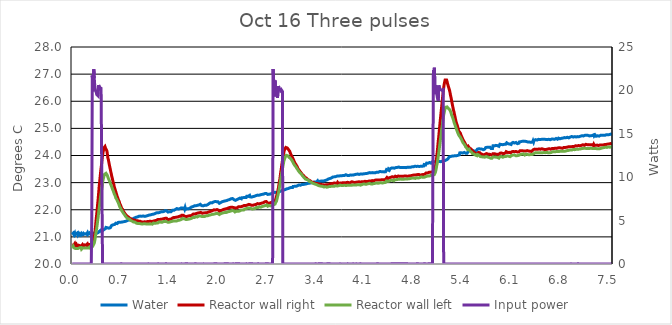
| Category | Water | Reactor wall right | Reactor wall left |
|---|---|---|---|
| 0.0015577622222222223 | 21.09 | 20.711 | 20.597 |
| 0.008027616666666666 | 21.113 | 20.715 | 20.602 |
| 0.014572455555555554 | 21.134 | 20.74 | 20.653 |
| 0.02137698611111111 | 21.094 | 20.7 | 20.603 |
| 0.028150972222222223 | 21.107 | 20.716 | 20.616 |
| 0.03498602777777778 | 21.148 | 20.751 | 20.626 |
| 0.04182113888888889 | 21.074 | 20.683 | 20.575 |
| 0.048596499999999994 | 21.108 | 20.706 | 20.583 |
| 0.055370472222222224 | 21.119 | 20.726 | 20.606 |
| 0.06214444444444445 | 21.122 | 20.676 | 20.569 |
| 0.06897952777777779 | 21.099 | 20.689 | 20.597 |
| 0.07578405555555556 | 21.153 | 20.708 | 20.605 |
| 0.08261913888888889 | 21.072 | 20.646 | 20.573 |
| 0.08939311111111112 | 21.088 | 20.691 | 20.583 |
| 0.09610600000000001 | 21.123 | 20.707 | 20.58 |
| 0.1029716111111111 | 21.1 | 20.686 | 20.6 |
| 0.10977613888888889 | 21.073 | 20.672 | 20.566 |
| 0.11655155555555556 | 21.106 | 20.688 | 20.582 |
| 0.12337130555555556 | 21.12 | 20.706 | 20.605 |
| 0.13017602777777776 | 21.076 | 20.666 | 20.549 |
| 0.13694983333333333 | 21.097 | 20.681 | 20.572 |
| 0.14370852777777776 | 21.106 | 20.715 | 20.588 |
| 0.15054361111111111 | 21.128 | 20.724 | 20.621 |
| 0.15731758333333334 | 21.088 | 20.657 | 20.566 |
| 0.16413738888888887 | 21.079 | 20.68 | 20.589 |
| 0.17091138888888888 | 21.114 | 20.704 | 20.599 |
| 0.1776867222222222 | 21.117 | 20.71 | 20.594 |
| 0.18449125 | 21.101 | 20.693 | 20.593 |
| 0.19132633333333335 | 21.084 | 20.69 | 20.57 |
| 0.19810033333333332 | 21.097 | 20.701 | 20.593 |
| 0.20487430555555555 | 21.113 | 20.706 | 20.593 |
| 0.2117246388888889 | 21.153 | 20.742 | 20.603 |
| 0.2184986388888889 | 21.092 | 20.69 | 20.592 |
| 0.22537952777777778 | 21.088 | 20.686 | 20.591 |
| 0.23210769444444446 | 21.097 | 20.69 | 20.62 |
| 0.23889694444444445 | 21.144 | 20.718 | 20.612 |
| 0.24567230555555555 | 21.147 | 20.751 | 20.633 |
| 0.2525073888888889 | 21.117 | 20.7 | 20.591 |
| 0.2592508055555556 | 21.082 | 20.7 | 20.603 |
| 0.2660901111111111 | 21.12 | 20.719 | 20.611 |
| 0.27287516666666667 | 21.125 | 20.729 | 20.616 |
| 0.279695 | 21.153 | 20.76 | 20.644 |
| 0.28643833333333335 | 21.14 | 20.781 | 20.657 |
| 0.2933344444444444 | 21.133 | 20.788 | 20.654 |
| 0.3000933333333333 | 21.108 | 20.857 | 20.689 |
| 0.3068825 | 21.131 | 20.97 | 20.772 |
| 0.3137022222222222 | 21.126 | 21.097 | 20.847 |
| 0.3204777777777778 | 21.149 | 21.254 | 20.965 |
| 0.3272363888888889 | 21.174 | 21.45 | 21.087 |
| 0.33404083333333334 | 21.209 | 21.655 | 21.218 |
| 0.3408761111111111 | 21.132 | 21.821 | 21.31 |
| 0.3476805555555556 | 21.135 | 21.996 | 21.446 |
| 0.35443916666666664 | 21.138 | 22.209 | 21.591 |
| 0.36127444444444445 | 21.156 | 22.39 | 21.725 |
| 0.3680483333333333 | 21.192 | 22.608 | 21.9 |
| 0.3748375 | 21.2 | 22.833 | 22.029 |
| 0.3816127777777778 | 21.205 | 23.014 | 22.183 |
| 0.38843277777777774 | 21.221 | 23.193 | 22.326 |
| 0.3952219444444444 | 21.241 | 23.381 | 22.487 |
| 0.40199583333333333 | 21.23 | 23.528 | 22.604 |
| 0.4088158333333334 | 21.189 | 23.677 | 22.716 |
| 0.41565083333333336 | 21.224 | 23.85 | 22.843 |
| 0.42247055555555557 | 21.23 | 23.998 | 22.983 |
| 0.4292294444444445 | 21.258 | 24.117 | 23.103 |
| 0.43600333333333335 | 21.258 | 24.207 | 23.172 |
| 0.44279250000000003 | 21.271 | 24.288 | 23.239 |
| 0.4495986111111111 | 21.294 | 24.314 | 23.305 |
| 0.45640305555555555 | 21.279 | 24.332 | 23.335 |
| 0.4631922222222222 | 21.304 | 24.276 | 23.33 |
| 0.4700272222222222 | 21.349 | 24.267 | 23.343 |
| 0.47680138888888884 | 21.358 | 24.201 | 23.32 |
| 0.48360583333333335 | 21.371 | 24.162 | 23.313 |
| 0.4903797222222222 | 21.335 | 24.033 | 23.261 |
| 0.49715388888888884 | 21.305 | 23.905 | 23.196 |
| 0.5039888888888888 | 21.325 | 23.838 | 23.151 |
| 0.5107475 | 21.321 | 23.741 | 23.117 |
| 0.5175688888888889 | 21.326 | 23.649 | 23.071 |
| 0.5243427777777778 | 21.35 | 23.56 | 23.018 |
| 0.5311777777777777 | 21.337 | 23.483 | 22.987 |
| 0.5379825 | 21.374 | 23.394 | 22.921 |
| 0.5447563888888889 | 21.394 | 23.314 | 22.885 |
| 0.5515761111111112 | 21.429 | 23.225 | 22.837 |
| 0.5583502777777778 | 21.416 | 23.153 | 22.778 |
| 0.5650936111111111 | 21.444 | 23.072 | 22.732 |
| 0.5719897222222222 | 21.447 | 22.99 | 22.691 |
| 0.5787788888888888 | 21.449 | 22.939 | 22.663 |
| 0.5855530555555556 | 21.467 | 22.847 | 22.586 |
| 0.5923130555555556 | 21.46 | 22.788 | 22.556 |
| 0.5991483333333334 | 21.47 | 22.73 | 22.507 |
| 0.6059222222222223 | 21.504 | 22.671 | 22.439 |
| 0.6127266666666666 | 21.491 | 22.61 | 22.428 |
| 0.6195158333333334 | 21.486 | 22.554 | 22.385 |
| 0.6263358333333334 | 21.491 | 22.485 | 22.339 |
| 0.6330944444444444 | 21.519 | 22.444 | 22.303 |
| 0.6399447222222222 | 21.532 | 22.383 | 22.265 |
| 0.6467186111111111 | 21.55 | 22.349 | 22.234 |
| 0.6535386111111111 | 21.556 | 22.309 | 22.173 |
| 0.6603138888888889 | 21.543 | 22.239 | 22.114 |
| 0.6671488888888889 | 21.551 | 22.198 | 22.109 |
| 0.6739230555555555 | 21.564 | 22.163 | 22.057 |
| 0.6807580555555555 | 21.542 | 22.118 | 22.031 |
| 0.6875013888888889 | 21.531 | 22.057 | 21.977 |
| 0.6943366666666667 | 21.543 | 22.043 | 21.953 |
| 0.7010952777777778 | 21.55 | 22.014 | 21.92 |
| 0.7079150000000001 | 21.536 | 21.959 | 21.889 |
| 0.7146891666666666 | 21.549 | 21.953 | 21.865 |
| 0.7214936111111111 | 21.562 | 21.909 | 21.829 |
| 0.7282688888888889 | 21.569 | 21.881 | 21.816 |
| 0.7350580555555555 | 21.562 | 21.853 | 21.798 |
| 0.7419238888888888 | 21.572 | 21.84 | 21.76 |
| 0.7486672222222223 | 21.58 | 21.806 | 21.747 |
| 0.7554869444444445 | 21.582 | 21.793 | 21.718 |
| 0.7622916666666667 | 21.595 | 21.768 | 21.731 |
| 0.7690808333333333 | 21.6 | 21.75 | 21.711 |
| 0.7759158333333334 | 21.613 | 21.739 | 21.669 |
| 0.7826441666666666 | 21.618 | 21.731 | 21.677 |
| 0.7894347222222222 | 21.608 | 21.719 | 21.656 |
| 0.7962391666666666 | 21.629 | 21.716 | 21.654 |
| 0.8031202777777778 | 21.621 | 21.68 | 21.641 |
| 0.8098941666666667 | 21.639 | 21.672 | 21.613 |
| 0.8166986111111111 | 21.631 | 21.675 | 21.615 |
| 0.8235030555555555 | 21.652 | 21.659 | 21.615 |
| 0.8302466666666667 | 21.639 | 21.662 | 21.587 |
| 0.8370205555555555 | 21.66 | 21.636 | 21.595 |
| 0.843825 | 21.665 | 21.628 | 21.579 |
| 0.8506602777777778 | 21.667 | 21.615 | 21.551 |
| 0.8574647222222223 | 21.67 | 21.618 | 21.561 |
| 0.86424 | 21.695 | 21.619 | 21.548 |
| 0.8711211111111111 | 21.687 | 21.609 | 21.546 |
| 0.8778644444444444 | 21.678 | 21.605 | 21.533 |
| 0.8846383333333333 | 21.719 | 21.6 | 21.535 |
| 0.8914736111111111 | 21.709 | 21.6 | 21.507 |
| 0.8982016666666667 | 21.728 | 21.599 | 21.512 |
| 0.905021388888889 | 21.732 | 21.596 | 21.486 |
| 0.9117802777777778 | 21.744 | 21.596 | 21.494 |
| 0.9186305555555556 | 21.74 | 21.578 | 21.489 |
| 0.9254349999999999 | 21.758 | 21.581 | 21.486 |
| 0.9322102777777778 | 21.745 | 21.589 | 21.494 |
| 0.9389997222222222 | 21.758 | 21.589 | 21.491 |
| 0.9458347222222222 | 21.766 | 21.576 | 21.476 |
| 0.9526238888888888 | 21.758 | 21.563 | 21.481 |
| 0.9594591666666666 | 21.766 | 21.56 | 21.476 |
| 0.9662483333333334 | 21.758 | 21.547 | 21.468 |
| 0.9729763888888889 | 21.766 | 21.545 | 21.476 |
| 0.9797811111111111 | 21.771 | 21.55 | 21.471 |
| 0.9865702777777777 | 21.771 | 21.55 | 21.476 |
| 0.99339 | 21.758 | 21.547 | 21.481 |
| 1.0001652777777776 | 21.748 | 21.547 | 21.46 |
| 1.0069547222222222 | 21.756 | 21.555 | 21.471 |
| 1.0137744444444445 | 21.771 | 21.542 | 21.481 |
| 1.0205636111111112 | 21.771 | 21.563 | 21.478 |
| 1.0273836111111112 | 21.766 | 21.552 | 21.473 |
| 1.0341575 | 21.776 | 21.56 | 21.476 |
| 1.0409466666666667 | 21.756 | 21.563 | 21.458 |
| 1.047751388888889 | 21.784 | 21.565 | 21.466 |
| 1.0545252777777778 | 21.794 | 21.56 | 21.471 |
| 1.0613602777777777 | 21.797 | 21.555 | 21.453 |
| 1.0681358333333333 | 21.802 | 21.571 | 21.484 |
| 1.074986111111111 | 21.792 | 21.56 | 21.473 |
| 1.081836388888889 | 21.794 | 21.558 | 21.496 |
| 1.088595 | 21.812 | 21.578 | 21.478 |
| 1.095353888888889 | 21.818 | 21.565 | 21.476 |
| 1.1021277777777778 | 21.818 | 21.578 | 21.478 |
| 1.1089016666666667 | 21.828 | 21.565 | 21.484 |
| 1.1157522222222223 | 21.833 | 21.583 | 21.468 |
| 1.1225719444444444 | 21.841 | 21.581 | 21.491 |
| 1.129361111111111 | 21.836 | 21.581 | 21.509 |
| 1.1361366666666668 | 21.836 | 21.591 | 21.476 |
| 1.1429105555555557 | 21.856 | 21.604 | 21.491 |
| 1.1496844444444443 | 21.856 | 21.596 | 21.504 |
| 1.1565349999999999 | 21.872 | 21.599 | 21.489 |
| 1.1633241666666665 | 21.879 | 21.625 | 21.504 |
| 1.1700980555555556 | 21.885 | 21.607 | 21.507 |
| 1.1768719444444444 | 21.872 | 21.617 | 21.507 |
| 1.1837225 | 21.874 | 21.617 | 21.502 |
| 1.1905575 | 21.89 | 21.64 | 21.509 |
| 1.1972855555555555 | 21.887 | 21.648 | 21.522 |
| 1.204061111111111 | 21.9 | 21.632 | 21.53 |
| 1.210896111111111 | 21.895 | 21.638 | 21.553 |
| 1.217731111111111 | 21.885 | 21.645 | 21.52 |
| 1.2245052777777778 | 21.913 | 21.638 | 21.527 |
| 1.2312791666666665 | 21.918 | 21.65 | 21.543 |
| 1.238083611111111 | 21.916 | 21.658 | 21.551 |
| 1.2448577777777778 | 21.939 | 21.648 | 21.558 |
| 1.2516927777777778 | 21.928 | 21.656 | 21.54 |
| 1.2584972222222222 | 21.941 | 21.656 | 21.538 |
| 1.2653169444444443 | 21.941 | 21.679 | 21.556 |
| 1.2720772222222223 | 21.931 | 21.669 | 21.566 |
| 1.2788969444444445 | 21.952 | 21.669 | 21.569 |
| 1.285625 | 21.954 | 21.679 | 21.579 |
| 1.2924908333333331 | 21.967 | 21.684 | 21.569 |
| 1.2993105555555555 | 21.972 | 21.669 | 21.576 |
| 1.3060844444444446 | 21.983 | 21.689 | 21.595 |
| 1.3128738888888887 | 21.961 | 21.685 | 21.561 |
| 1.3196783333333333 | 21.947 | 21.664 | 21.558 |
| 1.3264522222222221 | 21.927 | 21.66 | 21.565 |
| 1.3332569444444446 | 21.914 | 21.624 | 21.536 |
| 1.3400627777777776 | 21.901 | 21.635 | 21.536 |
| 1.3468366666666667 | 21.924 | 21.629 | 21.531 |
| 1.3536108333333332 | 21.929 | 21.65 | 21.544 |
| 1.3604305555555556 | 21.95 | 21.658 | 21.549 |
| 1.3672044444444444 | 21.919 | 21.653 | 21.547 |
| 1.37407 | 21.924 | 21.653 | 21.562 |
| 1.3808288888888889 | 21.955 | 21.673 | 21.562 |
| 1.3876027777777777 | 21.955 | 21.658 | 21.588 |
| 1.3944225000000001 | 21.98 | 21.694 | 21.573 |
| 1.4011966666666666 | 21.951 | 21.684 | 21.552 |
| 1.4080330555555556 | 21.968 | 21.681 | 21.565 |
| 1.4148986111111113 | 21.979 | 21.716 | 21.591 |
| 1.4216269444444445 | 21.982 | 21.719 | 21.573 |
| 1.428416111111111 | 21.992 | 21.706 | 21.596 |
| 1.4351747222222222 | 22.01 | 21.719 | 21.585 |
| 1.441994722222222 | 22.028 | 21.708 | 21.596 |
| 1.4487991666666666 | 22.004 | 21.734 | 21.601 |
| 1.455603611111111 | 22.043 | 21.729 | 21.588 |
| 1.4624080555555554 | 22.015 | 21.75 | 21.614 |
| 1.4691822222222222 | 22.033 | 21.75 | 21.611 |
| 1.4759575 | 22.025 | 21.739 | 21.609 |
| 1.4827925 | 22.048 | 21.737 | 21.627 |
| 1.4895819444444445 | 22.051 | 21.755 | 21.634 |
| 1.496371111111111 | 22.041 | 21.765 | 21.619 |
| 1.5031755555555555 | 22.035 | 21.757 | 21.64 |
| 1.5099344444444445 | 22.061 | 21.77 | 21.627 |
| 1.5167847222222224 | 22.069 | 21.76 | 21.642 |
| 1.5235738888888888 | 22.056 | 21.799 | 21.663 |
| 1.5303783333333334 | 22.082 | 21.781 | 21.645 |
| 1.5371525 | 22.061 | 21.788 | 21.673 |
| 1.5439430555555556 | 22.072 | 21.796 | 21.655 |
| 1.5507780555555557 | 22.069 | 21.794 | 21.686 |
| 1.5575675000000002 | 22.066 | 21.792 | 21.67 |
| 1.5644025000000001 | 22.021 | 21.762 | 21.639 |
| 1.5711458333333332 | 22.081 | 21.789 | 21.662 |
| 1.577981111111111 | 22.017 | 21.79 | 21.644 |
| 1.5847091666666668 | 22.026 | 21.747 | 21.644 |
| 1.5915288888888888 | 22.029 | 21.762 | 21.649 |
| 1.5983488888888888 | 22.039 | 21.762 | 21.643 |
| 1.6051227777777777 | 22.049 | 21.762 | 21.638 |
| 1.6119591666666666 | 22.052 | 21.762 | 21.651 |
| 1.6187944444444444 | 22.039 | 21.783 | 21.654 |
| 1.6255377777777777 | 22.052 | 21.775 | 21.654 |
| 1.6323116666666666 | 22.07 | 21.796 | 21.659 |
| 1.6391619444444445 | 22.061 | 21.784 | 21.664 |
| 1.6459055555555555 | 22.07 | 21.775 | 21.674 |
| 1.6526794444444444 | 22.083 | 21.797 | 21.687 |
| 1.6595144444444445 | 22.101 | 21.811 | 21.682 |
| 1.6663358333333333 | 22.1 | 21.806 | 21.703 |
| 1.6730930555555557 | 22.104 | 21.828 | 21.677 |
| 1.6798683333333333 | 22.117 | 21.826 | 21.721 |
| 1.6866730555555556 | 22.112 | 21.846 | 21.723 |
| 1.6934775 | 22.124 | 21.841 | 21.708 |
| 1.7002819444444446 | 22.145 | 21.852 | 21.713 |
| 1.707056111111111 | 22.147 | 21.841 | 21.716 |
| 1.7138758333333335 | 22.14 | 21.859 | 21.718 |
| 1.7206497222222221 | 22.147 | 21.862 | 21.747 |
| 1.7275152777777778 | 22.152 | 21.862 | 21.739 |
| 1.7342894444444446 | 22.137 | 21.872 | 21.747 |
| 1.7410633333333334 | 22.163 | 21.88 | 21.734 |
| 1.747838611111111 | 22.175 | 21.88 | 21.749 |
| 1.7547197222222222 | 22.18 | 21.875 | 21.757 |
| 1.7614783333333333 | 22.173 | 21.895 | 21.772 |
| 1.7682980555555554 | 22.203 | 21.888 | 21.767 |
| 1.7750263888888889 | 22.191 | 21.885 | 21.767 |
| 1.781846111111111 | 22.201 | 21.911 | 21.77 |
| 1.7886811111111112 | 22.196 | 21.903 | 21.783 |
| 1.795455277777778 | 22.194 | 21.89 | 21.775 |
| 1.8022902777777778 | 22.151 | 21.871 | 21.751 |
| 1.8090641666666667 | 22.167 | 21.871 | 21.761 |
| 1.8158841666666667 | 22.151 | 21.862 | 21.751 |
| 1.8226288888888889 | 22.143 | 21.877 | 21.753 |
| 1.829402777777778 | 22.153 | 21.882 | 21.774 |
| 1.8362224999999999 | 22.151 | 21.882 | 21.756 |
| 1.8430425000000001 | 22.166 | 21.882 | 21.753 |
| 1.8498163888888888 | 22.176 | 21.887 | 21.766 |
| 1.8566666666666667 | 22.174 | 21.88 | 21.753 |
| 1.8634255555555557 | 22.163 | 21.895 | 21.776 |
| 1.8702605555555556 | 22.198 | 21.889 | 21.784 |
| 1.8770191666666667 | 22.189 | 21.895 | 21.779 |
| 1.8838544444444445 | 22.186 | 21.917 | 21.779 |
| 1.8906297222222221 | 22.207 | 21.911 | 21.805 |
| 1.8974341666666668 | 22.207 | 21.924 | 21.779 |
| 1.9042080555555556 | 22.226 | 21.922 | 21.797 |
| 1.9109822222222221 | 22.223 | 21.93 | 21.805 |
| 1.9177408333333335 | 22.225 | 21.946 | 21.799 |
| 1.9245605555555554 | 22.261 | 21.938 | 21.81 |
| 1.9313958333333332 | 22.235 | 21.946 | 21.812 |
| 1.9381697222222223 | 22.281 | 21.959 | 21.823 |
| 1.94502 | 22.253 | 21.966 | 21.828 |
| 1.9517955555555555 | 22.268 | 21.969 | 21.823 |
| 1.9586000000000001 | 22.268 | 21.959 | 21.846 |
| 1.9653738888888888 | 22.286 | 21.974 | 21.836 |
| 1.9721480555555555 | 22.284 | 21.997 | 21.843 |
| 1.9789525000000001 | 22.271 | 21.974 | 21.843 |
| 1.9857569444444445 | 22.302 | 21.995 | 21.848 |
| 1.9925919444444444 | 22.299 | 21.989 | 21.866 |
| 1.9993661111111112 | 22.291 | 21.992 | 21.848 |
| 2.006231666666667 | 22.299 | 22.005 | 21.866 |
| 2.012929166666667 | 22.314 | 22.008 | 21.866 |
| 2.019781111111111 | 22.283 | 21.988 | 21.851 |
| 2.026555 | 22.296 | 21.99 | 21.861 |
| 2.0333441666666667 | 22.274 | 21.987 | 21.861 |
| 2.0401183333333335 | 22.28 | 21.991 | 21.866 |
| 2.0469227777777776 | 22.239 | 21.943 | 21.824 |
| 2.0537425 | 22.254 | 21.938 | 21.842 |
| 2.060486111111111 | 22.262 | 21.953 | 21.852 |
| 2.0673669444444442 | 22.267 | 21.969 | 21.86 |
| 2.0741408333333333 | 22.267 | 21.981 | 21.844 |
| 2.080914722222222 | 22.281 | 21.994 | 21.865 |
| 2.0877208333333335 | 22.299 | 21.987 | 21.875 |
| 2.0945252777777776 | 22.287 | 21.982 | 21.875 |
| 2.1013297222222223 | 22.317 | 22.001 | 21.863 |
| 2.108103888888889 | 22.313 | 22.014 | 21.893 |
| 2.114908333333333 | 22.318 | 22.006 | 21.886 |
| 2.1217433333333333 | 22.323 | 22.029 | 21.881 |
| 2.1285175 | 22.326 | 22.027 | 21.896 |
| 2.1353066666666667 | 22.339 | 22.027 | 21.912 |
| 2.142141666666667 | 22.351 | 22.042 | 21.917 |
| 2.148931111111111 | 22.339 | 22.04 | 21.904 |
| 2.1557216666666665 | 22.354 | 22.068 | 21.927 |
| 2.1624802777777776 | 22.336 | 22.045 | 21.899 |
| 2.1693155555555554 | 22.362 | 22.063 | 21.927 |
| 2.17612 | 22.377 | 22.071 | 21.93 |
| 2.1828938888888887 | 22.374 | 22.06 | 21.93 |
| 2.1897441666666664 | 22.377 | 22.084 | 21.937 |
| 2.1965183333333336 | 22.377 | 22.068 | 21.961 |
| 2.2032616666666667 | 22.385 | 22.089 | 21.953 |
| 2.210096666666667 | 22.405 | 22.091 | 21.958 |
| 2.2168555555555556 | 22.402 | 22.094 | 21.966 |
| 2.2236155555555555 | 22.392 | 22.089 | 21.955 |
| 2.2304505555555556 | 22.415 | 22.091 | 21.971 |
| 2.237255277777778 | 22.407 | 22.104 | 21.971 |
| 2.2441055555555556 | 22.398 | 22.089 | 21.981 |
| 2.2508488888888887 | 22.371 | 22.077 | 21.955 |
| 2.2576686111111113 | 22.397 | 22.102 | 21.952 |
| 2.2644427777777776 | 22.347 | 22.068 | 21.918 |
| 2.2712777777777777 | 22.347 | 22.065 | 21.928 |
| 2.2780669444444444 | 22.347 | 22.07 | 21.931 |
| 2.284856388888889 | 22.352 | 22.06 | 21.949 |
| 2.2916608333333333 | 22.375 | 22.068 | 21.959 |
| 2.298497222222222 | 22.356 | 22.064 | 21.946 |
| 2.3052408333333334 | 22.397 | 22.087 | 21.941 |
| 2.3120147222222225 | 22.4 | 22.108 | 21.977 |
| 2.3188038888888887 | 22.393 | 22.103 | 21.962 |
| 2.3256391666666665 | 22.404 | 22.123 | 21.951 |
| 2.332443611111111 | 22.427 | 22.108 | 21.985 |
| 2.3392175 | 22.424 | 22.116 | 21.977 |
| 2.3460219444444443 | 22.424 | 22.116 | 21.982 |
| 2.3529030555555552 | 22.404 | 22.116 | 22.003 |
| 2.359556111111111 | 22.444 | 22.131 | 21.995 |
| 2.3664216666666666 | 22.447 | 22.121 | 21.99 |
| 2.373195833333333 | 22.429 | 22.134 | 22.008 |
| 2.380046111111111 | 22.447 | 22.149 | 22.016 |
| 2.386789444444444 | 22.452 | 22.167 | 21.99 |
| 2.393594166666667 | 22.455 | 22.159 | 22.013 |
| 2.4004291666666666 | 22.455 | 22.149 | 22.029 |
| 2.4072030555555557 | 22.467 | 22.18 | 22.034 |
| 2.4139925 | 22.47 | 22.157 | 22.039 |
| 2.4208274999999997 | 22.455 | 22.169 | 22.039 |
| 2.4276166666666668 | 22.496 | 22.18 | 22.068 |
| 2.4343311111111112 | 22.478 | 22.169 | 22.034 |
| 2.4412119444444444 | 22.501 | 22.185 | 22.062 |
| 2.447985833333333 | 22.493 | 22.2 | 22.068 |
| 2.454790277777778 | 22.503 | 22.197 | 22.039 |
| 2.4615644444444444 | 22.501 | 22.205 | 22.065 |
| 2.468399444444444 | 22.529 | 22.225 | 22.088 |
| 2.475188611111111 | 22.477 | 22.188 | 22.057 |
| 2.481962777777778 | 22.493 | 22.18 | 22.049 |
| 2.488751944444444 | 22.469 | 22.176 | 22.059 |
| 2.4955869444444443 | 22.466 | 22.162 | 22.041 |
| 2.502377777777778 | 22.471 | 22.159 | 22.03 |
| 2.5092280555555555 | 22.467 | 22.147 | 22.066 |
| 2.515956111111111 | 22.484 | 22.163 | 22.053 |
| 2.5228066666666664 | 22.492 | 22.169 | 22.033 |
| 2.5295194444444444 | 22.481 | 22.194 | 22.053 |
| 2.536325277777778 | 22.499 | 22.188 | 22.048 |
| 2.5431588888888887 | 22.507 | 22.186 | 22.046 |
| 2.5499941666666666 | 22.504 | 22.196 | 22.058 |
| 2.5567527777777777 | 22.522 | 22.191 | 22.074 |
| 2.563512777777778 | 22.509 | 22.209 | 22.089 |
| 2.570332777777778 | 22.527 | 22.206 | 22.079 |
| 2.577106666666667 | 22.54 | 22.227 | 22.089 |
| 2.583895833333333 | 22.532 | 22.217 | 22.077 |
| 2.590731111111111 | 22.538 | 22.219 | 22.097 |
| 2.597520277777778 | 22.535 | 22.214 | 22.082 |
| 2.6043858333333336 | 22.553 | 22.232 | 22.107 |
| 2.6111138888888887 | 22.553 | 22.234 | 22.102 |
| 2.617918611111111 | 22.55 | 22.229 | 22.11 |
| 2.6247536111111107 | 22.558 | 22.237 | 22.095 |
| 2.6315275 | 22.558 | 22.247 | 22.128 |
| 2.6382725000000002 | 22.566 | 22.247 | 22.131 |
| 2.6451227777777775 | 22.553 | 22.252 | 22.123 |
| 2.6518969444444442 | 22.576 | 22.265 | 22.1 |
| 2.6586708333333333 | 22.573 | 22.26 | 22.153 |
| 2.665536388888889 | 22.568 | 22.27 | 22.136 |
| 2.672279722222222 | 22.589 | 22.278 | 22.148 |
| 2.679145555555556 | 22.596 | 22.293 | 22.138 |
| 2.685919444444444 | 22.604 | 22.288 | 22.156 |
| 2.692769722222222 | 22.606 | 22.301 | 22.161 |
| 2.699468611111111 | 22.601 | 22.303 | 22.166 |
| 2.7062733333333338 | 22.635 | 22.303 | 22.176 |
| 2.713077777777778 | 22.629 | 22.303 | 22.169 |
| 2.719882222222222 | 22.565 | 22.244 | 22.13 |
| 2.726671666666667 | 22.546 | 22.221 | 22.127 |
| 2.7334455555555555 | 22.577 | 22.274 | 22.14 |
| 2.740234722222222 | 22.573 | 22.237 | 22.157 |
| 2.74707 | 22.577 | 22.25 | 22.165 |
| 2.7538591666666665 | 22.583 | 22.269 | 22.144 |
| 2.7606330555555556 | 22.582 | 22.261 | 22.142 |
| 2.767439166666667 | 22.592 | 22.261 | 22.15 |
| 2.774258888888889 | 22.605 | 22.259 | 22.15 |
| 2.7810777777777775 | 22.613 | 22.284 | 22.152 |
| 2.787822222222222 | 22.61 | 22.264 | 22.152 |
| 2.794597222222222 | 22.613 | 22.297 | 22.162 |
| 2.8014916666666667 | 22.628 | 22.312 | 22.183 |
| 2.808236111111111 | 22.641 | 22.282 | 22.155 |
| 2.8150083333333336 | 22.628 | 22.322 | 22.193 |
| 2.8218 | 22.646 | 22.325 | 22.211 |
| 2.8286194444444446 | 22.649 | 22.373 | 22.254 |
| 2.8354222222222223 | 22.649 | 22.422 | 22.282 |
| 2.842258333333333 | 22.633 | 22.455 | 22.321 |
| 2.8490333333333333 | 22.656 | 22.562 | 22.395 |
| 2.855838888888889 | 22.643 | 22.631 | 22.474 |
| 2.8626722222222223 | 22.659 | 22.718 | 22.542 |
| 2.8694027777777777 | 22.674 | 22.82 | 22.634 |
| 2.876175 | 22.633 | 22.935 | 22.716 |
| 2.8830416666666667 | 22.669 | 23.055 | 22.836 |
| 2.889813888888889 | 22.682 | 23.144 | 22.923 |
| 2.896575 | 22.689 | 23.3 | 23.06 |
| 2.903363888888889 | 22.692 | 23.422 | 23.163 |
| 2.9101527777777774 | 22.707 | 23.547 | 23.282 |
| 2.9170194444444446 | 22.723 | 23.677 | 23.39 |
| 2.9238555555555554 | 22.71 | 23.797 | 23.484 |
| 2.930597222222222 | 22.707 | 23.922 | 23.596 |
| 2.9374333333333333 | 22.725 | 24.045 | 23.693 |
| 2.9441916666666668 | 22.728 | 24.114 | 23.793 |
| 2.9509666666666665 | 22.73 | 24.193 | 23.844 |
| 2.9577861111111114 | 22.746 | 24.234 | 23.905 |
| 2.964588888888889 | 22.746 | 24.264 | 23.948 |
| 2.971363888888889 | 22.751 | 24.297 | 23.971 |
| 2.9782166666666665 | 22.766 | 24.297 | 24.007 |
| 2.9849888888888887 | 22.771 | 24.297 | 24.007 |
| 2.9917472222222226 | 22.776 | 24.277 | 23.992 |
| 2.9985999999999997 | 22.799 | 24.251 | 23.989 |
| 3.0053722222222223 | 22.781 | 24.249 | 23.989 |
| 3.012147222222222 | 22.791 | 24.205 | 23.966 |
| 3.018997222222222 | 22.809 | 24.175 | 23.928 |
| 3.0257722222222223 | 22.807 | 24.154 | 23.918 |
| 3.032575 | 22.791 | 24.098 | 23.905 |
| 3.039411111111111 | 22.822 | 24.07 | 23.882 |
| 3.046138888888889 | 22.822 | 24.022 | 23.862 |
| 3.052913888888889 | 22.82 | 23.991 | 23.836 |
| 3.0596888888888887 | 22.837 | 23.945 | 23.816 |
| 3.0665694444444442 | 22.822 | 23.912 | 23.772 |
| 3.073372222222222 | 22.86 | 23.871 | 23.752 |
| 3.0801166666666666 | 22.86 | 23.838 | 23.698 |
| 3.0868916666666664 | 22.853 | 23.787 | 23.67 |
| 3.0937416666666664 | 22.863 | 23.751 | 23.668 |
| 3.100513888888889 | 22.876 | 23.713 | 23.617 |
| 3.1072888888888888 | 22.868 | 23.677 | 23.594 |
| 3.114125 | 22.865 | 23.659 | 23.576 |
| 3.1209444444444445 | 22.886 | 23.624 | 23.538 |
| 3.1277333333333335 | 22.881 | 23.596 | 23.507 |
| 3.1345083333333332 | 22.886 | 23.557 | 23.489 |
| 3.1412666666666667 | 22.891 | 23.511 | 23.471 |
| 3.148102777777778 | 22.894 | 23.481 | 23.428 |
| 3.154922222222222 | 22.914 | 23.466 | 23.41 |
| 3.161772222222222 | 22.896 | 23.448 | 23.415 |
| 3.168547222222222 | 22.909 | 23.414 | 23.364 |
| 3.1753055555555556 | 22.904 | 23.389 | 23.346 |
| 3.1820805555555554 | 22.932 | 23.381 | 23.333 |
| 3.1889000000000003 | 22.911 | 23.346 | 23.308 |
| 3.1957055555555556 | 22.934 | 23.312 | 23.29 |
| 3.2024944444444445 | 22.924 | 23.297 | 23.254 |
| 3.2092694444444447 | 22.934 | 23.272 | 23.239 |
| 3.2160416666666665 | 22.934 | 23.261 | 23.229 |
| 3.222861111111111 | 22.929 | 23.246 | 23.196 |
| 3.2296805555555554 | 22.947 | 23.218 | 23.196 |
| 3.2364555555555556 | 22.942 | 23.195 | 23.175 |
| 3.2433055555555557 | 22.937 | 23.18 | 23.132 |
| 3.250080555555556 | 22.973 | 23.175 | 23.15 |
| 3.2568555555555556 | 22.955 | 23.17 | 23.127 |
| 3.263691666666667 | 22.965 | 23.149 | 23.112 |
| 3.270463888888889 | 22.96 | 23.124 | 23.106 |
| 3.2772694444444443 | 22.97 | 23.106 | 23.086 |
| 3.2840416666666665 | 22.985 | 23.108 | 23.094 |
| 3.290847222222222 | 22.996 | 23.096 | 23.058 |
| 3.2976666666666667 | 22.978 | 23.096 | 23.043 |
| 3.3044555555555557 | 22.996 | 23.062 | 23.035 |
| 3.3112305555555555 | 22.983 | 23.065 | 23.03 |
| 3.3180055555555557 | 22.99 | 23.047 | 23.025 |
| 3.324811111111111 | 22.998 | 23.034 | 23.017 |
| 3.3315833333333336 | 22.996 | 23.016 | 23.012 |
| 3.3383888888888893 | 22.996 | 23.022 | 22.989 |
| 3.3452555555555556 | 23.016 | 23.006 | 22.981 |
| 3.3520444444444446 | 23.001 | 23.014 | 22.979 |
| 3.358802777777778 | 23.016 | 22.996 | 22.966 |
| 3.3656083333333333 | 22.996 | 23.001 | 22.969 |
| 3.372411111111111 | 23.006 | 22.976 | 22.933 |
| 3.3792166666666668 | 23.026 | 22.981 | 22.943 |
| 3.386036111111111 | 23.031 | 22.968 | 22.925 |
| 3.3928277777777778 | 23.031 | 22.971 | 22.923 |
| 3.3996166666666667 | 23.026 | 22.971 | 22.928 |
| 3.406388888888889 | 23.034 | 22.96 | 22.907 |
| 3.413177777777778 | 23.067 | 22.963 | 22.912 |
| 3.419922222222222 | 23.029 | 22.955 | 22.897 |
| 3.426727777777778 | 23.052 | 22.95 | 22.892 |
| 3.433561111111111 | 23.047 | 22.95 | 22.91 |
| 3.4403972222222223 | 23.047 | 22.942 | 22.882 |
| 3.4471416666666665 | 23.049 | 22.955 | 22.884 |
| 3.453947222222222 | 23.029 | 22.94 | 22.872 |
| 3.460736111111111 | 23.057 | 22.93 | 22.867 |
| 3.467602777777778 | 23.044 | 22.912 | 22.879 |
| 3.4743444444444442 | 23.059 | 22.925 | 22.861 |
| 3.4812111111111115 | 23.062 | 22.932 | 22.864 |
| 3.4879527777777777 | 23.059 | 22.907 | 22.849 |
| 3.494788888888889 | 23.08 | 22.919 | 22.859 |
| 3.5015944444444442 | 23.064 | 22.912 | 22.838 |
| 3.508397222222222 | 23.057 | 22.914 | 22.833 |
| 3.5151416666666666 | 23.087 | 22.909 | 22.841 |
| 3.5219944444444446 | 23.081 | 22.908 | 22.851 |
| 3.5287361111111113 | 23.091 | 22.929 | 22.867 |
| 3.535572222222222 | 23.062 | 22.922 | 22.861 |
| 3.542375 | 23.1 | 22.902 | 22.831 |
| 3.549211111111111 | 23.111 | 22.926 | 22.852 |
| 3.5559388888888885 | 23.097 | 22.926 | 22.846 |
| 3.5627277777777775 | 23.134 | 22.926 | 22.847 |
| 3.5695333333333332 | 23.134 | 22.916 | 22.854 |
| 3.576352777777778 | 23.119 | 22.914 | 22.831 |
| 3.5831416666666667 | 23.151 | 22.951 | 22.86 |
| 3.589933333333333 | 23.146 | 22.943 | 22.847 |
| 3.5967083333333334 | 23.185 | 22.96 | 22.865 |
| 3.603511111111111 | 23.168 | 22.961 | 22.862 |
| 3.6102861111111113 | 23.182 | 22.953 | 22.868 |
| 3.617088888888889 | 23.194 | 22.953 | 22.891 |
| 3.623911111111111 | 23.205 | 22.97 | 22.862 |
| 3.6306833333333333 | 23.212 | 22.963 | 22.863 |
| 3.6375333333333337 | 23.206 | 22.955 | 22.873 |
| 3.6442916666666667 | 23.213 | 22.987 | 22.863 |
| 3.6511277777777775 | 23.201 | 22.981 | 22.87 |
| 3.657902777777778 | 23.233 | 22.99 | 22.873 |
| 3.664677777777778 | 23.221 | 22.977 | 22.888 |
| 3.671497222222222 | 23.221 | 22.972 | 22.893 |
| 3.678286111111111 | 23.233 | 22.972 | 22.896 |
| 3.685122222222222 | 23.241 | 22.97 | 22.876 |
| 3.691863888888889 | 23.241 | 23.008 | 22.893 |
| 3.698638888888889 | 23.244 | 22.977 | 22.911 |
| 3.705475 | 23.244 | 22.959 | 22.883 |
| 3.7122472222222225 | 23.269 | 22.99 | 22.893 |
| 3.719127777777778 | 23.249 | 22.972 | 22.893 |
| 3.7258722222222223 | 23.251 | 22.987 | 22.909 |
| 3.732663888888889 | 23.232 | 22.981 | 22.901 |
| 3.739436111111111 | 23.244 | 23 | 22.886 |
| 3.746286111111111 | 23.249 | 22.985 | 22.891 |
| 3.753077777777778 | 23.259 | 22.972 | 22.865 |
| 3.7598499999999997 | 23.264 | 22.987 | 22.891 |
| 3.7666388888888886 | 23.264 | 22.998 | 22.893 |
| 3.7734138888888893 | 23.275 | 22.996 | 22.896 |
| 3.7802194444444446 | 23.256 | 23.003 | 22.881 |
| 3.787052777777778 | 23.264 | 22.99 | 22.906 |
| 3.793827777777778 | 23.255 | 22.996 | 22.904 |
| 3.800677777777778 | 23.269 | 22.991 | 22.893 |
| 3.807422222222222 | 23.29 | 22.998 | 22.891 |
| 3.8141972222222225 | 23.274 | 22.982 | 22.886 |
| 3.821 | 23.279 | 22.99 | 22.899 |
| 3.8278055555555555 | 23.266 | 23.012 | 22.904 |
| 3.8346416666666663 | 23.279 | 23.003 | 22.888 |
| 3.8414305555555552 | 23.267 | 22.994 | 22.909 |
| 3.8482194444444446 | 23.26 | 22.999 | 22.901 |
| 3.8549916666666664 | 23.275 | 22.996 | 22.909 |
| 3.861813888888889 | 23.261 | 23.005 | 22.899 |
| 3.868588888888889 | 23.281 | 22.999 | 22.901 |
| 3.875391666666667 | 23.281 | 23.006 | 22.893 |
| 3.8821666666666665 | 23.278 | 23.013 | 22.916 |
| 3.889002777777778 | 23.276 | 23.032 | 22.904 |
| 3.8957750000000004 | 23.28 | 23.004 | 22.888 |
| 3.9025805555555557 | 23.265 | 23.002 | 22.906 |
| 3.9093555555555555 | 23.28 | 23.015 | 22.916 |
| 3.916225 | 23.3 | 22.997 | 22.914 |
| 3.923008333333333 | 23.278 | 23.01 | 22.909 |
| 3.9298 | 23.295 | 23.005 | 22.909 |
| 3.9365583333333336 | 23.288 | 23 | 22.914 |
| 3.9433944444444444 | 23.293 | 23.015 | 22.899 |
| 3.9501527777777774 | 23.308 | 23.015 | 22.911 |
| 3.956955555555556 | 23.28 | 22.997 | 22.927 |
| 3.963808333333333 | 23.288 | 23.013 | 22.916 |
| 3.970580555555556 | 23.316 | 23.025 | 22.924 |
| 3.977386111111111 | 23.306 | 23.008 | 22.939 |
| 3.9841583333333332 | 23.303 | 23.013 | 22.929 |
| 3.9909333333333334 | 23.303 | 23.031 | 22.924 |
| 3.997738888888889 | 23.313 | 23.033 | 22.927 |
| 4.004527777777778 | 23.3 | 23.023 | 22.924 |
| 4.011316666666667 | 23.318 | 23.02 | 22.906 |
| 4.018138888888888 | 23.316 | 23.038 | 22.927 |
| 4.024911111111111 | 23.306 | 23.02 | 22.919 |
| 4.031747222222222 | 23.313 | 23.036 | 22.929 |
| 4.038536111111111 | 23.308 | 23.028 | 22.934 |
| 4.045355555555556 | 23.323 | 23.048 | 22.929 |
| 4.052113888888889 | 23.323 | 23.031 | 22.952 |
| 4.058919444444444 | 23.339 | 23.036 | 22.95 |
| 4.0656944444444445 | 23.339 | 23.038 | 22.939 |
| 4.0725444444444445 | 23.331 | 23.048 | 22.944 |
| 4.07935 | 23.321 | 23.038 | 22.952 |
| 4.0860916666666665 | 23.334 | 23.043 | 22.955 |
| 4.092913888888889 | 23.334 | 23.041 | 22.942 |
| 4.099672222222222 | 23.359 | 23.048 | 22.973 |
| 4.106491666666667 | 23.334 | 23.051 | 22.955 |
| 4.113294444444445 | 23.349 | 23.046 | 22.957 |
| 4.120069444444445 | 23.354 | 23.051 | 22.955 |
| 4.126875 | 23.354 | 23.056 | 22.952 |
| 4.13365 | 23.369 | 23.061 | 22.973 |
| 4.140499999999999 | 23.346 | 23.066 | 22.98 |
| 4.147288888888889 | 23.382 | 23.061 | 22.952 |
| 4.1541250000000005 | 23.359 | 23.061 | 22.952 |
| 4.160822222222222 | 23.377 | 23.089 | 22.973 |
| 4.1677027777777775 | 23.369 | 23.053 | 22.975 |
| 4.174508333333333 | 23.369 | 23.074 | 22.95 |
| 4.1812805555555554 | 23.364 | 23.099 | 22.98 |
| 4.188069444444444 | 23.364 | 23.069 | 22.98 |
| 4.194861111111111 | 23.364 | 23.069 | 22.965 |
| 4.201694444444445 | 23.364 | 23.074 | 22.973 |
| 4.2085 | 23.372 | 23.079 | 22.97 |
| 4.215275 | 23.362 | 23.092 | 22.975 |
| 4.222094444444445 | 23.395 | 23.084 | 22.955 |
| 4.228838888888888 | 23.372 | 23.11 | 22.96 |
| 4.235658333333333 | 23.385 | 23.094 | 22.985 |
| 4.242416666666667 | 23.387 | 23.094 | 22.98 |
| 4.2492222222222225 | 23.405 | 23.074 | 22.98 |
| 4.256025 | 23.38 | 23.094 | 22.978 |
| 4.2628305555555555 | 23.395 | 23.074 | 22.99 |
| 4.269619444444444 | 23.397 | 23.089 | 23.001 |
| 4.276472222222222 | 23.408 | 23.099 | 22.99 |
| 4.283305555555556 | 23.408 | 23.115 | 23.006 |
| 4.29005 | 23.405 | 23.087 | 22.99 |
| 4.296822222222222 | 23.405 | 23.102 | 22.993 |
| 4.303613888888889 | 23.41 | 23.105 | 22.998 |
| 4.310402777777778 | 23.403 | 23.092 | 23.003 |
| 4.317205555555556 | 23.405 | 23.107 | 22.985 |
| 4.324041666666666 | 23.431 | 23.105 | 22.983 |
| 4.330847222222222 | 23.413 | 23.097 | 22.993 |
| 4.33765 | 23.395 | 23.107 | 23.001 |
| 4.3444416666666665 | 23.41 | 23.102 | 23.008 |
| 4.351186111111112 | 23.42 | 23.112 | 22.993 |
| 4.358036111111111 | 23.4 | 23.107 | 23.008 |
| 4.3648694444444445 | 23.417 | 23.144 | 23.006 |
| 4.371627777777778 | 23.483 | 23.172 | 23.06 |
| 4.378402777777778 | 23.472 | 23.191 | 23.045 |
| 4.385177777777778 | 23.467 | 23.169 | 23.055 |
| 4.391997222222223 | 23.462 | 23.152 | 23.044 |
| 4.3987694444444445 | 23.505 | 23.184 | 23.065 |
| 4.405605555555556 | 23.522 | 23.184 | 23.063 |
| 4.412380555555555 | 23.466 | 23.179 | 23.06 |
| 4.419155555555555 | 23.506 | 23.194 | 23.076 |
| 4.425944444444444 | 23.516 | 23.209 | 23.086 |
| 4.432794444444444 | 23.513 | 23.198 | 23.089 |
| 4.4395999999999995 | 23.536 | 23.206 | 23.109 |
| 4.446372222222222 | 23.543 | 23.216 | 23.086 |
| 4.453161111111111 | 23.518 | 23.218 | 23.086 |
| 4.459936111111111 | 23.543 | 23.211 | 23.096 |
| 4.466741666666667 | 23.526 | 23.208 | 23.104 |
| 4.473575 | 23.537 | 23.199 | 23.068 |
| 4.480352777777778 | 23.532 | 23.225 | 23.083 |
| 4.487094444444445 | 23.549 | 23.218 | 23.107 |
| 4.493975 | 23.531 | 23.239 | 23.107 |
| 4.50075 | 23.554 | 23.229 | 23.101 |
| 4.507555555555555 | 23.551 | 23.231 | 23.109 |
| 4.514327777777778 | 23.549 | 23.213 | 23.104 |
| 4.521116666666667 | 23.561 | 23.244 | 23.096 |
| 4.527966666666667 | 23.536 | 23.234 | 23.119 |
| 4.534741666666666 | 23.547 | 23.245 | 23.112 |
| 4.541547222222222 | 23.574 | 23.24 | 23.107 |
| 4.548322222222222 | 23.554 | 23.24 | 23.127 |
| 4.555155555555556 | 23.555 | 23.23 | 23.119 |
| 4.561930555555556 | 23.557 | 23.228 | 23.107 |
| 4.568705555555556 | 23.554 | 23.232 | 23.13 |
| 4.5755083333333335 | 23.578 | 23.237 | 23.124 |
| 4.5822972222222225 | 23.558 | 23.223 | 23.109 |
| 4.589133333333334 | 23.552 | 23.23 | 23.124 |
| 4.595938888888889 | 23.58 | 23.237 | 23.127 |
| 4.602741666666667 | 23.561 | 23.235 | 23.135 |
| 4.609516666666666 | 23.554 | 23.228 | 23.124 |
| 4.6163388888888885 | 23.558 | 23.24 | 23.119 |
| 4.623066666666667 | 23.561 | 23.265 | 23.135 |
| 4.629886111111111 | 23.567 | 23.238 | 23.135 |
| 4.636661111111111 | 23.56 | 23.246 | 23.137 |
| 4.643494444444445 | 23.552 | 23.254 | 23.145 |
| 4.650269444444445 | 23.567 | 23.246 | 23.135 |
| 4.657072222222222 | 23.575 | 23.236 | 23.14 |
| 4.663847222222222 | 23.567 | 23.226 | 23.135 |
| 4.670683333333333 | 23.547 | 23.238 | 23.137 |
| 4.6774861111111115 | 23.554 | 23.241 | 23.16 |
| 4.684261111111111 | 23.562 | 23.241 | 23.158 |
| 4.691097222222222 | 23.537 | 23.259 | 23.145 |
| 4.697886111111111 | 23.575 | 23.251 | 23.15 |
| 4.704675000000001 | 23.565 | 23.261 | 23.16 |
| 4.711480555555556 | 23.595 | 23.251 | 23.158 |
| 4.718255555555556 | 23.585 | 23.259 | 23.155 |
| 4.725027777777777 | 23.582 | 23.284 | 23.16 |
| 4.731877777777777 | 23.588 | 23.251 | 23.168 |
| 4.738675 | 23.588 | 23.274 | 23.152 |
| 4.745472222222222 | 23.582 | 23.267 | 23.145 |
| 4.752269444444444 | 23.593 | 23.277 | 23.165 |
| 4.759066666666667 | 23.608 | 23.282 | 23.178 |
| 4.765863888888889 | 23.605 | 23.287 | 23.173 |
| 4.772661111111112 | 23.59 | 23.282 | 23.155 |
| 4.779458333333333 | 23.6 | 23.284 | 23.181 |
| 4.786255555555556 | 23.598 | 23.282 | 23.173 |
| 4.7930527777777785 | 23.593 | 23.272 | 23.181 |
| 4.79985 | 23.613 | 23.295 | 23.193 |
| 4.806647222222223 | 23.6 | 23.287 | 23.165 |
| 4.813444444444444 | 23.603 | 23.292 | 23.168 |
| 4.820241666666666 | 23.603 | 23.302 | 23.196 |
| 4.827038888888889 | 23.598 | 23.315 | 23.186 |
| 4.833836111111111 | 23.608 | 23.29 | 23.183 |
| 4.840633333333333 | 23.618 | 23.274 | 23.196 |
| 4.8474305555555555 | 23.6 | 23.292 | 23.191 |
| 4.854227777777778 | 23.623 | 23.305 | 23.211 |
| 4.861025 | 23.611 | 23.29 | 23.181 |
| 4.867822222222222 | 23.605 | 23.279 | 23.198 |
| 4.874619444444445 | 23.603 | 23.292 | 23.196 |
| 4.8814166666666665 | 23.636 | 23.3 | 23.193 |
| 4.888213888888889 | 23.612 | 23.319 | 23.204 |
| 4.895011111111112 | 23.665 | 23.322 | 23.196 |
| 4.901808333333333 | 23.634 | 23.307 | 23.206 |
| 4.908605555555555 | 23.662 | 23.34 | 23.196 |
| 4.915402777777778 | 23.649 | 23.33 | 23.219 |
| 4.922199999999999 | 23.67 | 23.357 | 23.22 |
| 4.928997222222222 | 23.719 | 23.364 | 23.251 |
| 4.935794444444444 | 23.708 | 23.351 | 23.238 |
| 4.942591666666667 | 23.706 | 23.352 | 23.23 |
| 4.949388888888889 | 23.717 | 23.384 | 23.246 |
| 4.956186111111111 | 23.7 | 23.374 | 23.243 |
| 4.962983333333334 | 23.731 | 23.38 | 23.253 |
| 4.969780555555555 | 23.739 | 23.398 | 23.266 |
| 4.976577777777778 | 23.746 | 23.363 | 23.251 |
| 4.9833750000000006 | 23.736 | 23.386 | 23.261 |
| 4.990172222222222 | 23.718 | 23.403 | 23.246 |
| 4.996969444444445 | 23.741 | 23.388 | 23.276 |
| 5.003766666666667 | 23.759 | 23.391 | 23.261 |
| 5.010563888888888 | 23.739 | 23.411 | 23.266 |
| 5.017361111111111 | 23.749 | 23.396 | 23.271 |
| 5.024158333333333 | 23.765 | 23.399 | 23.274 |
| 5.030955555555555 | 23.744 | 23.416 | 23.274 |
| 5.0377527777777775 | 23.769 | 23.431 | 23.299 |
| 5.04455 | 23.774 | 23.482 | 23.315 |
| 5.051347222222222 | 23.769 | 23.574 | 23.376 |
| 5.058144444444444 | 23.764 | 23.687 | 23.442 |
| 5.064941666666667 | 23.774 | 23.819 | 23.544 |
| 5.071738888888889 | 23.78 | 23.99 | 23.644 |
| 5.078536111111111 | 23.787 | 24.151 | 23.728 |
| 5.085333333333334 | 23.805 | 24.342 | 23.861 |
| 5.092130555555555 | 23.773 | 24.543 | 23.973 |
| 5.098927777777778 | 23.788 | 24.699 | 24.098 |
| 5.1057250000000005 | 23.781 | 24.907 | 24.241 |
| 5.112522222222223 | 23.784 | 25.09 | 24.391 |
| 5.119319444444444 | 23.791 | 25.285 | 24.534 |
| 5.126116666666666 | 23.771 | 25.464 | 24.675 |
| 5.132913888888889 | 23.788 | 25.641 | 24.797 |
| 5.139711111111111 | 23.784 | 25.818 | 24.965 |
| 5.146508333333333 | 23.788 | 26.001 | 25.07 |
| 5.153305555555556 | 23.811 | 26.169 | 25.218 |
| 5.1601027777777775 | 23.806 | 26.348 | 25.353 |
| 5.1669 | 23.788 | 26.488 | 25.491 |
| 5.173697222222223 | 23.793 | 26.621 | 25.57 |
| 5.180494444444444 | 23.813 | 26.71 | 25.667 |
| 5.187291666666667 | 23.816 | 26.784 | 25.718 |
| 5.194088888888889 | 23.829 | 26.794 | 25.779 |
| 5.200886111111111 | 23.829 | 26.789 | 25.795 |
| 5.207683333333334 | 23.841 | 26.784 | 25.797 |
| 5.214480555555556 | 23.836 | 26.725 | 25.792 |
| 5.221277777777777 | 23.841 | 26.649 | 25.782 |
| 5.228075 | 23.879 | 26.586 | 25.746 |
| 5.234872222222222 | 23.871 | 26.525 | 25.759 |
| 5.241669444444444 | 23.943 | 26.514 | 25.75 |
| 5.248466666666666 | 23.963 | 26.404 | 25.694 |
| 5.255263888888889 | 23.952 | 26.326 | 25.661 |
| 5.262061111111111 | 23.962 | 26.222 | 25.628 |
| 5.268858333333333 | 23.965 | 26.145 | 25.579 |
| 5.275655555555556 | 23.97 | 26.053 | 25.508 |
| 5.282452777777778 | 23.977 | 25.951 | 25.462 |
| 5.28925 | 23.985 | 25.862 | 25.418 |
| 5.296047222222223 | 23.998 | 25.773 | 25.367 |
| 5.302844444444445 | 23.98 | 25.678 | 25.316 |
| 5.309641666666667 | 23.985 | 25.614 | 25.24 |
| 5.316438888888889 | 24.005 | 25.53 | 25.184 |
| 5.323236111111112 | 23.994 | 25.446 | 25.14 |
| 5.330033333333333 | 23.983 | 25.358 | 25.087 |
| 5.336830555555555 | 23.983 | 25.277 | 25.036 |
| 5.343627777777778 | 23.991 | 25.206 | 24.974 |
| 5.3504249999999995 | 23.998 | 25.152 | 24.941 |
| 5.357222222222222 | 23.996 | 25.106 | 24.878 |
| 5.364019444444445 | 24.004 | 25.032 | 24.837 |
| 5.370816666666666 | 23.991 | 24.951 | 24.786 |
| 5.377613888888889 | 23.988 | 24.897 | 24.752 |
| 5.3844111111111115 | 24.022 | 24.868 | 24.717 |
| 5.391208333333333 | 24.097 | 24.872 | 24.731 |
| 5.398005555555556 | 24.106 | 24.83 | 24.68 |
| 5.404802777777778 | 24.091 | 24.774 | 24.639 |
| 5.4116 | 24.099 | 24.738 | 24.603 |
| 5.4183972222222225 | 24.078 | 24.687 | 24.58 |
| 5.425194444444444 | 24.088 | 24.649 | 24.527 |
| 5.431991666666666 | 24.088 | 24.608 | 24.491 |
| 5.4387888888888885 | 24.109 | 24.575 | 24.46 |
| 5.445586111111111 | 24.093 | 24.536 | 24.448 |
| 5.452383333333334 | 24.114 | 24.506 | 24.42 |
| 5.459180555555555 | 24.095 | 24.482 | 24.389 |
| 5.465977777777778 | 24.078 | 24.435 | 24.361 |
| 5.472775 | 24.084 | 24.403 | 24.315 |
| 5.479572222222222 | 24.084 | 24.378 | 24.289 |
| 5.486369444444445 | 24.074 | 24.342 | 24.277 |
| 5.493166666666667 | 24.086 | 24.322 | 24.267 |
| 5.499963888888889 | 24.086 | 24.309 | 24.218 |
| 5.506761111111111 | 24.085 | 24.277 | 24.203 |
| 5.513558333333334 | 24.172 | 24.322 | 24.245 |
| 5.520355555555555 | 24.166 | 24.301 | 24.235 |
| 5.527152777777777 | 24.164 | 24.272 | 24.201 |
| 5.53395 | 24.179 | 24.255 | 24.163 |
| 5.540747222222222 | 24.179 | 24.262 | 24.158 |
| 5.547544444444444 | 24.169 | 24.242 | 24.148 |
| 5.554341666666667 | 24.189 | 24.221 | 24.127 |
| 5.561138888888888 | 24.179 | 24.211 | 24.107 |
| 5.567936111111111 | 24.176 | 24.168 | 24.069 |
| 5.5747333333333335 | 24.184 | 24.16 | 24.071 |
| 5.581530555555555 | 24.184 | 24.155 | 24.066 |
| 5.588327777777778 | 24.156 | 24.124 | 24.053 |
| 5.595125 | 24.159 | 24.118 | 24.043 |
| 5.601922222222222 | 24.139 | 24.111 | 24.02 |
| 5.608719444444445 | 24.159 | 24.078 | 24.015 |
| 5.615516666666667 | 24.162 | 24.065 | 24.005 |
| 5.62231388888889 | 24.167 | 24.063 | 23.979 |
| 5.6291111111111105 | 24.188 | 24.078 | 23.993 |
| 5.635908333333333 | 24.233 | 24.096 | 24.039 |
| 5.642705555555556 | 24.257 | 24.113 | 24.019 |
| 5.649502777777777 | 24.262 | 24.111 | 24.011 |
| 5.6563 | 24.249 | 24.1 | 24.014 |
| 5.6630972222222224 | 24.27 | 24.093 | 23.999 |
| 5.669894444444444 | 24.242 | 24.103 | 23.991 |
| 5.676691666666667 | 24.242 | 24.067 | 23.96 |
| 5.683488888888889 | 24.249 | 24.065 | 23.966 |
| 5.690286111111111 | 24.247 | 24.059 | 23.95 |
| 5.6970833333333335 | 24.239 | 24.059 | 23.95 |
| 5.703880555555556 | 24.242 | 24.043 | 23.937 |
| 5.710677777777778 | 24.217 | 24.032 | 23.935 |
| 5.717475 | 24.212 | 24.023 | 23.948 |
| 5.724272222222223 | 24.222 | 24.016 | 23.922 |
| 5.731069444444444 | 24.209 | 24.018 | 23.922 |
| 5.737866666666666 | 24.235 | 24.023 | 23.938 |
| 5.744663888888889 | 24.271 | 24.05 | 23.941 |
| 5.7514611111111105 | 24.292 | 24.07 | 23.946 |
| 5.758258333333333 | 24.319 | 24.086 | 23.964 |
| 5.765055555555556 | 24.302 | 24.071 | 23.957 |
| 5.771852777777777 | 24.304 | 24.063 | 23.939 |
| 5.77865 | 24.302 | 24.056 | 23.944 |
| 5.785447222222222 | 24.307 | 24.048 | 23.952 |
| 5.792244444444445 | 24.307 | 24.053 | 23.929 |
| 5.799041666666667 | 24.304 | 24.048 | 23.926 |
| 5.805838888888889 | 24.307 | 24.046 | 23.918 |
| 5.812636111111112 | 24.303 | 24.024 | 23.913 |
| 5.8194333333333335 | 24.278 | 24.022 | 23.903 |
| 5.826230555555556 | 24.258 | 24.026 | 23.929 |
| 5.833027777777779 | 24.282 | 24.04 | 23.921 |
| 5.839824999999999 | 24.282 | 24.004 | 23.903 |
| 5.846622222222222 | 24.259 | 24.007 | 23.888 |
| 5.8534194444444445 | 24.358 | 24.066 | 23.948 |
| 5.860216666666666 | 24.364 | 24.098 | 23.955 |
| 5.867013888888889 | 24.367 | 24.08 | 23.943 |
| 5.873811111111111 | 24.356 | 24.065 | 23.945 |
| 5.880608333333333 | 24.369 | 24.077 | 23.927 |
| 5.887405555555556 | 24.367 | 24.07 | 23.93 |
| 5.894202777777778 | 24.372 | 24.049 | 23.938 |
| 5.901 | 24.367 | 24.039 | 23.912 |
| 5.907797222222222 | 24.372 | 24.049 | 23.933 |
| 5.914594444444445 | 24.363 | 24.043 | 23.93 |
| 5.921391666666667 | 24.342 | 24.048 | 23.907 |
| 5.928188888888889 | 24.339 | 24.025 | 23.91 |
| 5.934986111111112 | 24.339 | 24.029 | 23.904 |
| 5.9417833333333325 | 24.368 | 24.035 | 23.925 |
| 5.948580555555555 | 24.415 | 24.082 | 23.954 |
| 5.955377777777778 | 24.424 | 24.089 | 23.97 |
| 5.962175 | 24.429 | 24.084 | 23.964 |
| 5.968972222222222 | 24.404 | 24.094 | 23.962 |
| 5.9757694444444445 | 24.409 | 24.079 | 23.949 |
| 5.982566666666667 | 24.419 | 24.086 | 23.939 |
| 5.989363888888889 | 24.399 | 24.076 | 23.936 |
| 5.996161111111111 | 24.422 | 24.081 | 23.949 |
| 6.002958333333334 | 24.386 | 24.092 | 23.947 |
| 6.0097555555555555 | 24.411 | 24.076 | 23.962 |
| 6.016552777777778 | 24.382 | 24.063 | 23.939 |
| 6.023350000000001 | 24.41 | 24.089 | 23.945 |
| 6.030147222222222 | 24.416 | 24.102 | 23.96 |
| 6.036944444444444 | 24.433 | 24.141 | 23.994 |
| 6.043741666666667 | 24.469 | 24.139 | 23.989 |
| 6.050538888888888 | 24.443 | 24.121 | 23.986 |
| 6.057336111111111 | 24.454 | 24.113 | 23.979 |
| 6.064133333333333 | 24.431 | 24.116 | 23.981 |
| 6.070930555555555 | 24.464 | 24.101 | 23.973 |
| 6.077727777777778 | 24.431 | 24.116 | 23.966 |
| 6.084525 | 24.423 | 24.098 | 23.953 |
| 6.091322222222222 | 24.408 | 24.101 | 23.956 |
| 6.098119444444444 | 24.413 | 24.096 | 23.951 |
| 6.104916666666667 | 24.406 | 24.084 | 23.948 |
| 6.111713888888889 | 24.448 | 24.134 | 24.002 |
| 6.118511111111111 | 24.469 | 24.146 | 24.01 |
| 6.125308333333334 | 24.46 | 24.153 | 24.016 |
| 6.132105555555556 | 24.483 | 24.15 | 24.018 |
| 6.138902777777777 | 24.48 | 24.14 | 24.013 |
| 6.1457 | 24.48 | 24.158 | 24 |
| 6.152497222222222 | 24.46 | 24.14 | 24.018 |
| 6.159294444444444 | 24.46 | 24.145 | 23.995 |
| 6.1660916666666665 | 24.465 | 24.133 | 23.99 |
| 6.172888888888889 | 24.48 | 24.148 | 23.99 |
| 6.179686111111111 | 24.478 | 24.148 | 23.998 |
| 6.186483333333333 | 24.48 | 24.122 | 24 |
| 6.193280555555556 | 24.437 | 24.129 | 23.995 |
| 6.200077777777778 | 24.438 | 24.136 | 23.995 |
| 6.206875 | 24.417 | 24.117 | 23.988 |
| 6.213672222222223 | 24.454 | 24.137 | 24.008 |
| 6.220469444444444 | 24.501 | 24.166 | 24.037 |
| 6.227266666666667 | 24.497 | 24.175 | 24.022 |
| 6.2340638888888895 | 24.523 | 24.188 | 24.037 |
| 6.24086111111111 | 24.512 | 24.182 | 24.048 |
| 6.247658333333333 | 24.502 | 24.172 | 24.05 |
| 6.254455555555555 | 24.52 | 24.177 | 24.045 |
| 6.261252777777777 | 24.525 | 24.175 | 24.06 |
| 6.26805 | 24.523 | 24.172 | 24.06 |
| 6.274847222222222 | 24.512 | 24.162 | 24.06 |
| 6.281644444444444 | 24.53 | 24.167 | 24.048 |
| 6.2884416666666665 | 24.507 | 24.167 | 24.037 |
| 6.295238888888889 | 24.497 | 24.177 | 24.017 |
| 6.302036111111112 | 24.523 | 24.18 | 24.045 |
| 6.308833333333333 | 24.502 | 24.167 | 24.048 |
| 6.315630555555556 | 24.51 | 24.172 | 24.053 |
| 6.322427777777778 | 24.512 | 24.175 | 24.027 |
| 6.329225 | 24.5 | 24.181 | 24.053 |
| 6.336022222222223 | 24.497 | 24.155 | 24.035 |
| 6.342819444444445 | 24.495 | 24.168 | 24.037 |
| 6.349616666666666 | 24.465 | 24.164 | 24.027 |
| 6.356413888888889 | 24.485 | 24.151 | 24.027 |
| 6.363211111111111 | 24.495 | 24.146 | 24.014 |
| 6.370008333333333 | 24.475 | 24.157 | 24.03 |
| 6.376805555555555 | 24.488 | 24.146 | 24.035 |
| 6.383602777777778 | 24.485 | 24.162 | 24.025 |
| 6.3904 | 24.503 | 24.151 | 24.009 |
| 6.397197222222222 | 24.476 | 24.166 | 24.038 |
| 6.403994444444445 | 24.498 | 24.174 | 24.043 |
| 6.410791666666666 | 24.544 | 24.21 | 24.061 |
| 6.417588888888889 | 24.5 | 24.191 | 24.061 |
| 6.424386111111112 | 24.558 | 24.233 | 24.082 |
| 6.431183333333333 | 24.58 | 24.235 | 24.08 |
| 6.437980555555556 | 24.593 | 24.242 | 24.097 |
| 6.444777777777778 | 24.585 | 24.232 | 24.092 |
| 6.451574999999999 | 24.585 | 24.227 | 24.09 |
| 6.458372222222222 | 24.567 | 24.219 | 24.1 |
| 6.465169444444444 | 24.57 | 24.23 | 24.095 |
| 6.471966666666667 | 24.588 | 24.227 | 24.085 |
| 6.4787638888888885 | 24.578 | 24.23 | 24.1 |
| 6.485561111111111 | 24.595 | 24.222 | 24.097 |
| 6.492358333333334 | 24.59 | 24.242 | 24.087 |
| 6.499155555555555 | 24.58 | 24.245 | 24.103 |
| 6.505952777777778 | 24.59 | 24.227 | 24.11 |
| 6.5127500000000005 | 24.58 | 24.232 | 24.103 |
| 6.519547222222222 | 24.59 | 24.235 | 24.103 |
| 6.526344444444445 | 24.595 | 24.232 | 24.09 |
| 6.533141666666667 | 24.593 | 24.25 | 24.1 |
| 6.539938888888889 | 24.59 | 24.24 | 24.103 |
| 6.5467361111111115 | 24.603 | 24.232 | 24.1 |
| 6.553533333333334 | 24.611 | 24.232 | 24.077 |
| 6.560330555555555 | 24.602 | 24.223 | 24.108 |
| 6.5671277777777775 | 24.603 | 24.24 | 24.1 |
| 6.573925 | 24.58 | 24.219 | 24.118 |
| 6.580722222222222 | 24.595 | 24.236 | 24.105 |
| 6.587519444444444 | 24.591 | 24.237 | 24.115 |
| 6.594316666666667 | 24.601 | 24.223 | 24.115 |
| 6.6011138888888885 | 24.583 | 24.245 | 24.118 |
| 6.607911111111111 | 24.585 | 24.238 | 24.108 |
| 6.614708333333334 | 24.589 | 24.238 | 24.115 |
| 6.621505555555555 | 24.571 | 24.234 | 24.097 |
| 6.628302777777778 | 24.598 | 24.236 | 24.12 |
| 6.6351 | 24.576 | 24.25 | 24.108 |
| 6.641897222222223 | 24.588 | 24.24 | 24.1 |
| 6.648694444444445 | 24.583 | 24.234 | 24.118 |
| 6.655491666666666 | 24.594 | 24.232 | 24.128 |
| 6.662288888888889 | 24.601 | 24.237 | 24.11 |
| 6.669086111111111 | 24.604 | 24.26 | 24.113 |
| 6.675883333333333 | 24.604 | 24.26 | 24.128 |
| 6.682680555555556 | 24.581 | 24.247 | 24.138 |
| 6.689477777777777 | 24.606 | 24.257 | 24.131 |
| 6.696275 | 24.614 | 24.252 | 24.123 |
| 6.7030722222222225 | 24.611 | 24.263 | 24.141 |
| 6.709869444444444 | 24.596 | 24.242 | 24.136 |
| 6.716666666666667 | 24.617 | 24.268 | 24.131 |
| 6.723463888888889 | 24.601 | 24.255 | 24.141 |
| 6.730261111111111 | 24.627 | 24.273 | 24.148 |
| 6.737058333333334 | 24.617 | 24.263 | 24.151 |
| 6.743855555555556 | 24.617 | 24.265 | 24.151 |
| 6.750652777777777 | 24.601 | 24.27 | 24.146 |
| 6.7574499999999995 | 24.619 | 24.28 | 24.133 |
| 6.764247222222222 | 24.64 | 24.26 | 24.143 |
| 6.771044444444444 | 24.614 | 24.275 | 24.159 |
| 6.777841666666666 | 24.617 | 24.285 | 24.159 |
| 6.784638888888889 | 24.617 | 24.273 | 24.154 |
| 6.791436111111111 | 24.627 | 24.275 | 24.164 |
| 6.798233333333333 | 24.617 | 24.278 | 24.161 |
| 6.805030555555556 | 24.634 | 24.28 | 24.159 |
| 6.811827777777778 | 24.634 | 24.288 | 24.182 |
| 6.818625 | 24.65 | 24.265 | 24.169 |
| 6.8254222222222225 | 24.642 | 24.288 | 24.161 |
| 6.832219444444445 | 24.637 | 24.283 | 24.166 |
| 6.839016666666667 | 24.652 | 24.298 | 24.164 |
| 6.845813888888889 | 24.66 | 24.278 | 24.154 |
| 6.852611111111112 | 24.665 | 24.293 | 24.179 |
| 6.859408333333333 | 24.657 | 24.298 | 24.171 |
| 6.866205555555555 | 24.652 | 24.291 | 24.166 |
| 6.873002777777778 | 24.678 | 24.316 | 24.187 |
| 6.8797999999999995 | 24.675 | 24.303 | 24.194 |
| 6.886597222222222 | 24.673 | 24.298 | 24.184 |
| 6.893394444444445 | 24.673 | 24.324 | 24.179 |
| 6.900191666666666 | 24.683 | 24.319 | 24.197 |
| 6.906988888888889 | 24.65 | 24.314 | 24.189 |
| 6.913786111111111 | 24.668 | 24.316 | 24.187 |
| 6.920583333333333 | 24.673 | 24.324 | 24.187 |
| 6.927380555555556 | 24.68 | 24.344 | 24.205 |
| 6.934177777777778 | 24.675 | 24.321 | 24.192 |
| 6.940975 | 24.696 | 24.319 | 24.2 |
| 6.9477722222222225 | 24.701 | 24.329 | 24.2 |
| 6.954569444444445 | 24.701 | 24.324 | 24.197 |
| 6.961366666666666 | 24.688 | 24.334 | 24.202 |
| 6.968163888888888 | 24.68 | 24.331 | 24.222 |
| 6.974961111111111 | 24.678 | 24.344 | 24.212 |
| 6.9817583333333335 | 24.696 | 24.334 | 24.192 |
| 6.988555555555555 | 24.696 | 24.359 | 24.215 |
| 6.995352777777778 | 24.683 | 24.339 | 24.233 |
| 7.00215 | 24.688 | 24.359 | 24.245 |
| 7.008947222222222 | 24.683 | 24.362 | 24.23 |
| 7.015744444444445 | 24.683 | 24.349 | 24.225 |
| 7.022541666666667 | 24.702 | 24.351 | 24.235 |
| 7.029338888888889 | 24.696 | 24.352 | 24.228 |
| 7.036136111111111 | 24.689 | 24.368 | 24.217 |
| 7.042933333333334 | 24.708 | 24.367 | 24.238 |
| 7.049730555555556 | 24.692 | 24.386 | 24.235 |
| 7.056527777777778 | 24.706 | 24.352 | 24.238 |
| 7.063325000000001 | 24.724 | 24.359 | 24.24 |
| 7.0701222222222215 | 24.713 | 24.372 | 24.243 |
| 7.076919444444444 | 24.723 | 24.361 | 24.235 |
| 7.083716666666667 | 24.737 | 24.374 | 24.23 |
| 7.090513888888888 | 24.728 | 24.379 | 24.258 |
| 7.097311111111111 | 24.711 | 24.388 | 24.248 |
| 7.1041083333333335 | 24.717 | 24.397 | 24.251 |
| 7.110905555555555 | 24.721 | 24.385 | 24.263 |
| 7.117702777777778 | 24.72 | 24.371 | 24.263 |
| 7.1245 | 24.721 | 24.375 | 24.266 |
| 7.131297222222222 | 24.744 | 24.389 | 24.268 |
| 7.1380944444444445 | 24.712 | 24.389 | 24.258 |
| 7.144891666666667 | 24.746 | 24.412 | 24.261 |
| 7.15168888888889 | 24.744 | 24.39 | 24.258 |
| 7.158486111111111 | 24.719 | 24.377 | 24.253 |
| 7.165283333333334 | 24.757 | 24.397 | 24.261 |
| 7.172080555555556 | 24.743 | 24.394 | 24.261 |
| 7.178877777777777 | 24.756 | 24.389 | 24.281 |
| 7.185675 | 24.74 | 24.401 | 24.255 |
| 7.192472222222222 | 24.722 | 24.399 | 24.26 |
| 7.199269444444444 | 24.739 | 24.409 | 24.271 |
| 7.206066666666667 | 24.753 | 24.396 | 24.261 |
| 7.212863888888889 | 24.728 | 24.365 | 24.265 |
| 7.219661111111111 | 24.7 | 24.365 | 24.25 |
| 7.226458333333333 | 24.744 | 24.397 | 24.258 |
| 7.233255555555556 | 24.736 | 24.389 | 24.26 |
| 7.240052777777778 | 24.709 | 24.369 | 24.25 |
| 7.24685 | 24.716 | 24.371 | 24.242 |
| 7.253647222222223 | 24.762 | 24.411 | 24.26 |
| 7.2604444444444445 | 24.716 | 24.371 | 24.252 |
| 7.267241666666666 | 24.697 | 24.339 | 24.231 |
| 7.274038888888889 | 24.756 | 24.391 | 24.263 |
| 7.28083611111111 | 24.734 | 24.38 | 24.265 |
| 7.287633333333333 | 24.711 | 24.361 | 24.249 |
| 7.2944305555555555 | 24.719 | 24.375 | 24.252 |
| 7.301227777777777 | 24.732 | 24.383 | 24.265 |
| 7.308025 | 24.727 | 24.381 | 24.236 |
| 7.314822222222222 | 24.727 | 24.376 | 24.252 |
| 7.321619444444445 | 24.715 | 24.368 | 24.247 |
| 7.328416666666667 | 24.715 | 24.373 | 24.244 |
| 7.335213888888889 | 24.73 | 24.389 | 24.247 |
| 7.342011111111112 | 24.748 | 24.389 | 24.27 |
| 7.348808333333333 | 24.743 | 24.399 | 24.257 |
| 7.355605555555556 | 24.733 | 24.394 | 24.265 |
| 7.3624027777777785 | 24.75 | 24.389 | 24.259 |
| 7.369199999999999 | 24.745 | 24.401 | 24.277 |
| 7.375997222222222 | 24.758 | 24.391 | 24.28 |
| 7.382794444444444 | 24.735 | 24.386 | 24.252 |
| 7.389591666666666 | 24.75 | 24.404 | 24.28 |
| 7.396388888888889 | 24.758 | 24.409 | 24.295 |
| 7.403186111111111 | 24.756 | 24.401 | 24.29 |
| 7.409983333333333 | 24.745 | 24.401 | 24.282 |
| 7.4167805555555555 | 24.758 | 24.389 | 24.303 |
| 7.423577777777778 | 24.763 | 24.404 | 24.31 |
| 7.430375 | 24.766 | 24.417 | 24.275 |
| 7.437172222222222 | 24.771 | 24.427 | 24.298 |
| 7.443969444444445 | 24.781 | 24.419 | 24.303 |
| 7.4507666666666665 | 24.761 | 24.427 | 24.3 |
| 7.457563888888889 | 24.778 | 24.427 | 24.316 |
| 7.464361111111112 | 24.776 | 24.422 | 24.293 |
| 7.4711583333333325 | 24.771 | 24.435 | 24.308 |
| 7.477955555555555 | 24.784 | 24.43 | 24.305 |
| 7.484752777777778 | 24.789 | 24.437 | 24.313 |
| 7.49155 | 24.789 | 24.422 | 24.323 |
| 7.498347222222222 | 24.794 | 24.437 | 24.318 |
| 7.505144444444444 | 24.809 | 24.45 | 24.326 |
| 7.511941666666667 | 24.786 | 24.445 | 24.339 |
| 7.518738888888889 | 24.807 | 24.455 | 24.323 |